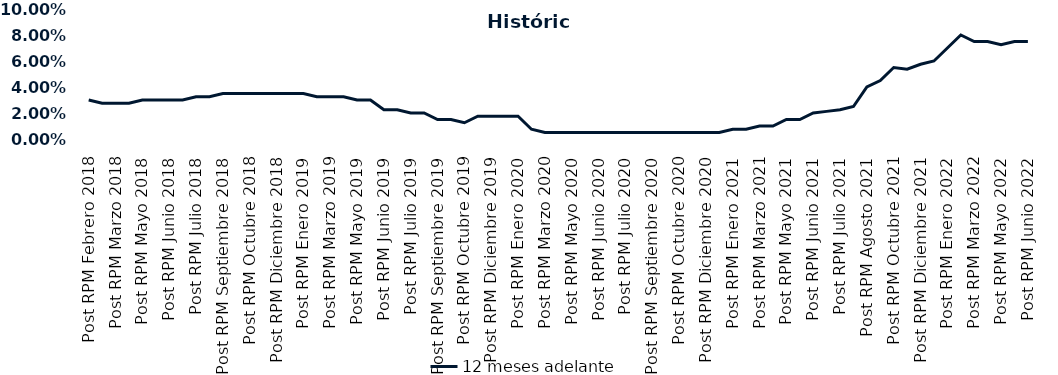
| Category | 12 meses adelante  |
|---|---|
| Post RPM Febrero 2018 | 0.03 |
| Pre RPM Marzo 2018 | 0.028 |
| Post RPM Marzo 2018 | 0.028 |
| Pre RPM Mayo 2018 | 0.028 |
| Post RPM Mayo 2018 | 0.03 |
| Pre RPM Junio 2018 | 0.03 |
| Post RPM Junio 2018 | 0.03 |
| Pre RPM Julio 2018 | 0.03 |
| Post RPM Julio 2018 | 0.032 |
| Pre RPM Septiembre 2018 | 0.032 |
| Post RPM Septiembre 2018 | 0.035 |
| Pre RPM Octubre 2018 | 0.035 |
| Post RPM Octubre 2018 | 0.035 |
| Pre RPM Diciembre 2018 | 0.035 |
| Post RPM Diciembre 2018 | 0.035 |
| Pre RPM Enero 2019 | 0.035 |
| Post RPM Enero 2019 | 0.035 |
| Pre RPM Marzo 2019 | 0.032 |
| Post RPM Marzo 2019 | 0.032 |
| Pre RPM Mayo 2019 | 0.032 |
| Post RPM Mayo 2019 | 0.03 |
| Pre RPM Junio 2019 | 0.03 |
| Post RPM Junio 2019 | 0.022 |
| Pre RPM Julio 2019 | 0.022 |
| Post RPM Julio 2019 | 0.02 |
| Pre RPM Septiembre 2019 | 0.02 |
| Post RPM Septiembre 2019 | 0.015 |
| Pre RPM Octubre 2019 | 0.015 |
| Post RPM Octubre 2019 | 0.012 |
| Pre RPM Diciembre 2019 | 0.018 |
| Post RPM Diciembre 2019 | 0.018 |
| Pre RPM Enero 2020 | 0.018 |
| Post RPM Enero 2020 | 0.018 |
| Pre RPM Marzo 2020 | 0.008 |
| Post RPM Marzo 2020 | 0.005 |
| Pre RPM Mayo 2020 | 0.005 |
| Post RPM Mayo 2020 | 0.005 |
| Pre RPM Junio 2020 | 0.005 |
| Post RPM Junio 2020 | 0.005 |
| Pre RPM Julio 2020 | 0.005 |
| Post RPM Julio 2020 | 0.005 |
| Pre RPM Septiembre 2020 | 0.005 |
| Post RPM Septiembre 2020 | 0.005 |
| Pre RPM Octubre 2020 | 0.005 |
| Post RPM Octubre 2020 | 0.005 |
| Pre RPM Diciembre 2020 | 0.005 |
| Post RPM Diciembre 2020 | 0.005 |
| Pre RPM Enero 2021 | 0.005 |
| Post RPM Enero 2021 | 0.008 |
| Pre RPM Marzo 2021 | 0.008 |
| Post RPM Marzo 2021 | 0.01 |
| Pre RPM Mayo 2021 | 0.01 |
| Post RPM Mayo 2021 | 0.015 |
| Pre RPM Junio 2021 | 0.015 |
| Post RPM Junio 2021 | 0.02 |
| Pre RPM Julio 2021 | 0.021 |
| Post RPM Julio 2021 | 0.022 |
| Pre RPM Agosto 2021 | 0.025 |
| Post RPM Agosto 2021 | 0.04 |
| Pre RPM Octubre 2021 | 0.045 |
| Post RPM Octubre 2021 | 0.055 |
| Pre RPM Diciembre 2021 | 0.054 |
| Post RPM Diciembre 2021 | 0.058 |
| Pre RPM Enero 2022 | 0.06 |
| Post RPM Enero 2022 | 0.07 |
| Pre RPM Marzo 2022 | 0.08 |
| Post RPM Marzo 2022 | 0.075 |
| Pre RPM Mayo 2022 | 0.075 |
| Post RPM Mayo 2022 | 0.072 |
| Pre RPM Junio 2022 | 0.075 |
| Post RPM Junio 2022 | 0.075 |